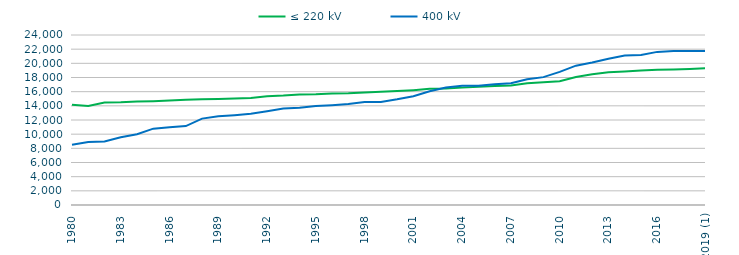
| Category | ≤ 220 kV | 400 kV |
|---|---|---|
| 1980 | 14139 | 8518 |
| 1981 | 13973 | 8906 |
| 1982 | 14466 | 8975 |
| 1983 | 14491 | 9563 |
| 1984 | 14598.3 | 9998 |
| 1985 | 14652.3 | 10781 |
| 1986 | 14746.3 | 10978 |
| 1987 | 14849.3 | 11147 |
| 1988 | 14938.3 | 12194 |
| 1989 | 14964.3 | 12533 |
| 1990 | 15034.5 | 12686 |
| 1991 | 15108.94 | 12883 |
| 1992 | 15356.14 | 13222 |
| 1993 | 15441.94 | 13611.17 |
| 1994 | 15585.94 | 13737.17 |
| 1995 | 15628.94 | 13969.73 |
| 1996 | 15733.54 | 14083.63 |
| 1997 | 15776.14 | 14243.65 |
| 1998 | 15875.92 | 14538.47 |
| 1999 | 15974.92 | 14538.47 |
| 2000 | 16077.74 | 14918 |
| 2001 | 16216.089 | 15365.738 |
| 2002 | 16398.354 | 16068.212 |
| 2003 | 16457.772 | 16588.936 |
| 2004 | 16570.461 | 16837.116 |
| 2005 | 16679.125 | 16843.11 |
| 2006 | 16816.645 | 17048.811 |
| 2007 | 16876.537 | 17187.474 |
| 2008 | 17199.371 | 17761.505 |
| 2009 | 17331.695 | 18052.905 |
| 2010 | 17481.268 | 18789.34 |
| 2011 | 18081.532 | 19668.271 |
| 2012 | 18450.847 | 20105.767 |
| 2013 | 18724.147 | 20636.399 |
| 2014 | 18863.265 | 21090.433 |
| 2015 | 19003.568 | 21180.747 |
| 2016 | 19091.545 | 21615.889 |
| 2017 | 19116.907 | 21724.85 |
| 2018 | 19192.41 | 21726.61 |
| 2019 (1) | 19294.862 | 21736.422 |